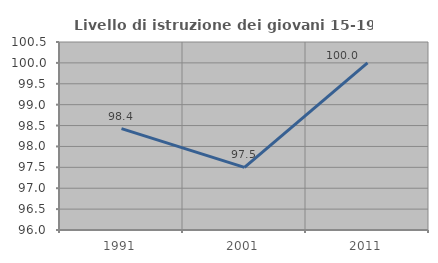
| Category | Livello di istruzione dei giovani 15-19 anni |
|---|---|
| 1991.0 | 98.425 |
| 2001.0 | 97.5 |
| 2011.0 | 100 |